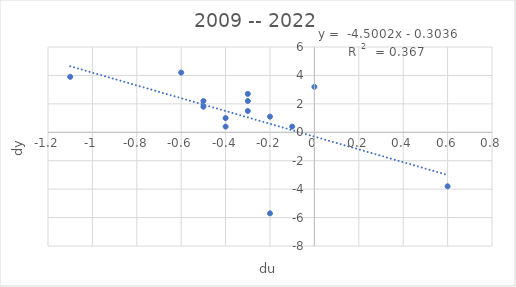
| Category | dy |
|---|---|
| -0.20000000000000018 | -5.7 |
| -0.6000000000000005 | 4.2 |
| -1.0999999999999996 | 3.9 |
| -0.40000000000000036 | 0.4 |
| -0.09999999999999964 | 0.4 |
| -0.2999999999999998 | 2.2 |
| -0.2999999999999998 | 1.5 |
| -0.5000000000000004 | 2.2 |
| -0.2999999999999998 | 2.7 |
| -0.3999999999999999 | 1 |
| -0.20000000000000018 | 1.1 |
| 0.6000000000000001 | -3.8 |
| 0.0 | 3.2 |
| -0.5 | 1.8 |